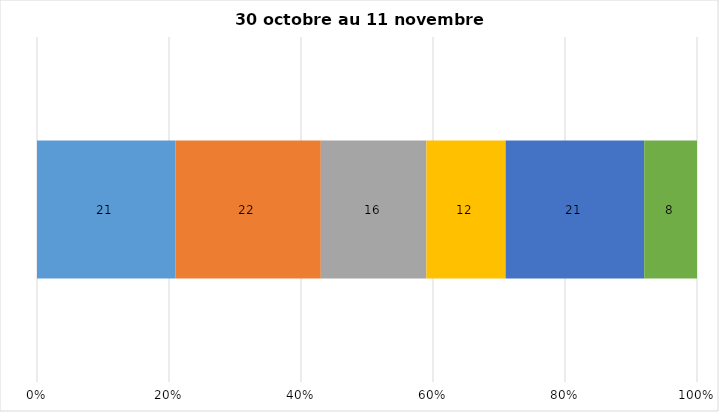
| Category | Plusieurs fois par jour | Une fois par jour | Quelques fois par semaine   | Une fois par semaine ou moins   |  Jamais   |  Je n’utilise pas les médias sociaux |
|---|---|---|---|---|---|---|
| 0 | 21 | 22 | 16 | 12 | 21 | 8 |